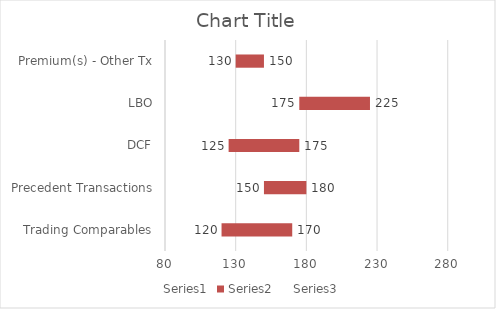
| Category | Series 0 | Series 1 | Series 2 |
|---|---|---|---|
| Trading Comparables | 120 | 50 | 170 |
| Precedent Transactions | 150 | 30 | 180 |
| DCF | 125 | 50 | 175 |
| LBO | 175 | 50 | 225 |
| Premium(s) - Other Tx | 130 | 20 | 150 |